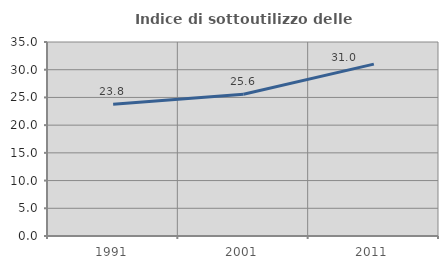
| Category | Indice di sottoutilizzo delle abitazioni  |
|---|---|
| 1991.0 | 23.784 |
| 2001.0 | 25.571 |
| 2011.0 | 31.008 |